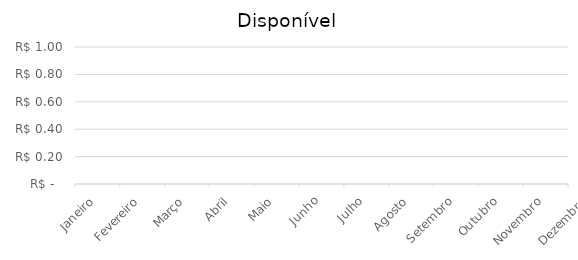
| Category | Disponível |
|---|---|
| Janeiro | 0 |
| Fevereiro | 0 |
| Março | 0 |
| Abril | 0 |
| Maio | 0 |
| Junho | 0 |
| Julho | 0 |
| Agosto | 0 |
| Setembro | 0 |
| Outubro | 0 |
| Novembro | 0 |
| Dezembro | 0 |